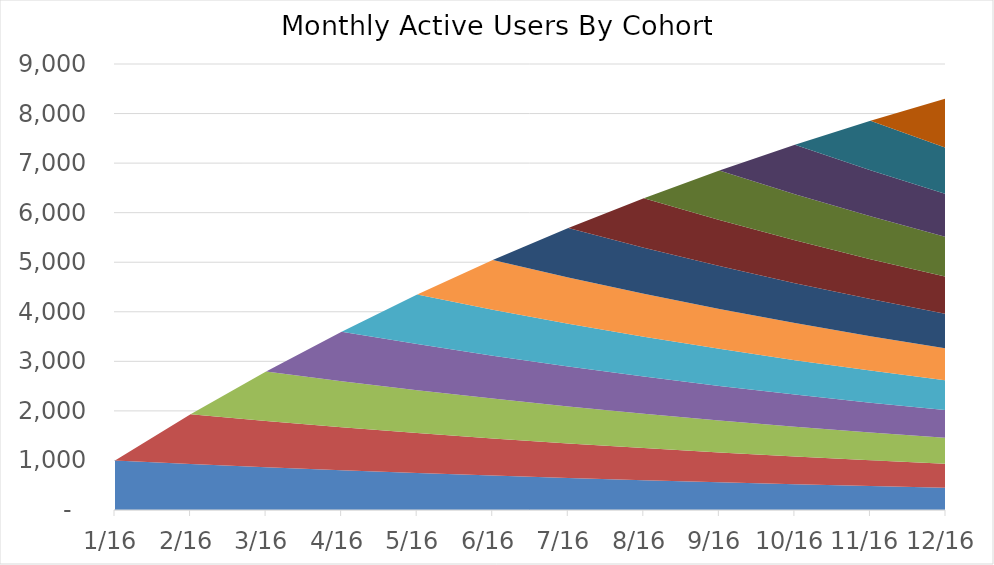
| Category | Series 0 | Series 1 | Series 2 | Series 3 | Series 4 | Series 5 | Series 6 | Series 7 | Series 8 | Series 9 | Series 10 | Series 11 |
|---|---|---|---|---|---|---|---|---|---|---|---|---|
| 2016-01-01 | 1000 | 0 | 0 | 0 | 0 | 0 | 0 | 0 | 0 | 0 | 0 | 0 |
| 2016-02-01 | 930 | 1000 | 0 | 0 | 0 | 0 | 0 | 0 | 0 | 0 | 0 | 0 |
| 2016-03-01 | 864.9 | 930 | 1000 | 0 | 0 | 0 | 0 | 0 | 0 | 0 | 0 | 0 |
| 2016-04-01 | 804.357 | 864.9 | 930 | 1000 | 0 | 0 | 0 | 0 | 0 | 0 | 0 | 0 |
| 2016-05-01 | 748.052 | 804.357 | 864.9 | 930 | 1000 | 0 | 0 | 0 | 0 | 0 | 0 | 0 |
| 2016-06-01 | 695.688 | 748.052 | 804.357 | 864.9 | 930 | 1000 | 0 | 0 | 0 | 0 | 0 | 0 |
| 2016-07-01 | 646.99 | 695.688 | 748.052 | 804.357 | 864.9 | 930 | 1000 | 0 | 0 | 0 | 0 | 0 |
| 2016-08-01 | 601.701 | 646.99 | 695.688 | 748.052 | 804.357 | 864.9 | 930 | 1000 | 0 | 0 | 0 | 0 |
| 2016-09-01 | 559.582 | 601.701 | 646.99 | 695.688 | 748.052 | 804.357 | 864.9 | 930 | 1000 | 0 | 0 | 0 |
| 2016-10-01 | 520.411 | 559.582 | 601.701 | 646.99 | 695.688 | 748.052 | 804.357 | 864.9 | 930 | 1000 | 0 | 0 |
| 2016-11-01 | 483.982 | 520.411 | 559.582 | 601.701 | 646.99 | 695.688 | 748.052 | 804.357 | 864.9 | 930 | 1000 | 0 |
| 2016-12-01 | 450.104 | 483.982 | 520.411 | 559.582 | 601.701 | 646.99 | 695.688 | 748.052 | 804.357 | 864.9 | 930 | 1000 |